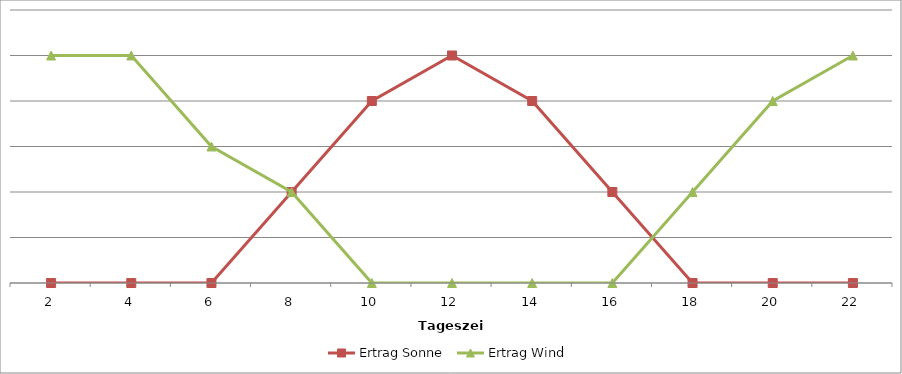
| Category | Ertrag Sonne | Ertrag Wind |
|---|---|---|
| 2.0 | 0 | 5 |
| 4.0 | 0 | 5 |
| 6.0 | 0 | 3 |
| 8.0 | 2 | 2 |
| 10.0 | 4 | 0 |
| 12.0 | 5 | 0 |
| 14.0 | 4 | 0 |
| 16.0 | 2 | 0 |
| 18.0 | 0 | 2 |
| 20.0 | 0 | 4 |
| 22.0 | 0 | 5 |